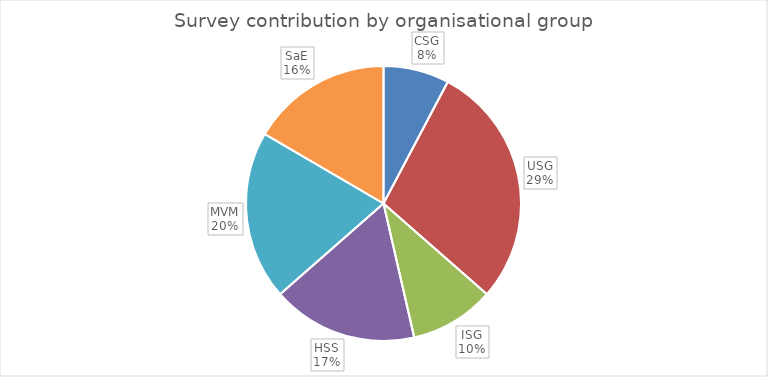
| Category | Series 0 |
|---|---|
| CSG | 14 |
| USG | 52 |
| ISG | 18 |
| HSS | 31 |
| MVM | 36 |
| SaE | 30 |